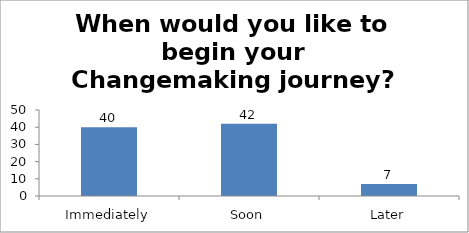
| Category | When would you like to begin your Changemaking journey?  |
|---|---|
| Immediately | 40 |
| Soon | 42 |
| Later | 7 |